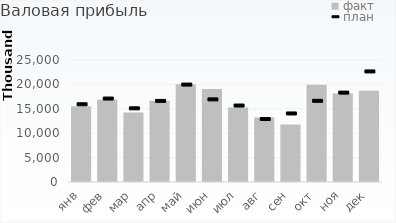
| Category | факт |
|---|---|
| янв | 15528960 |
| фев | 16842256.06 |
| мар | 14265193.656 |
| апр | 16652601.588 |
| май | 20012841.761 |
| июн | 19053471.574 |
| июл | 15274168.529 |
| авг | 13204982.158 |
| сен | 11791173.857 |
| окт | 19932696.188 |
| ноя | 18118507.351 |
| дек | 18690009.403 |